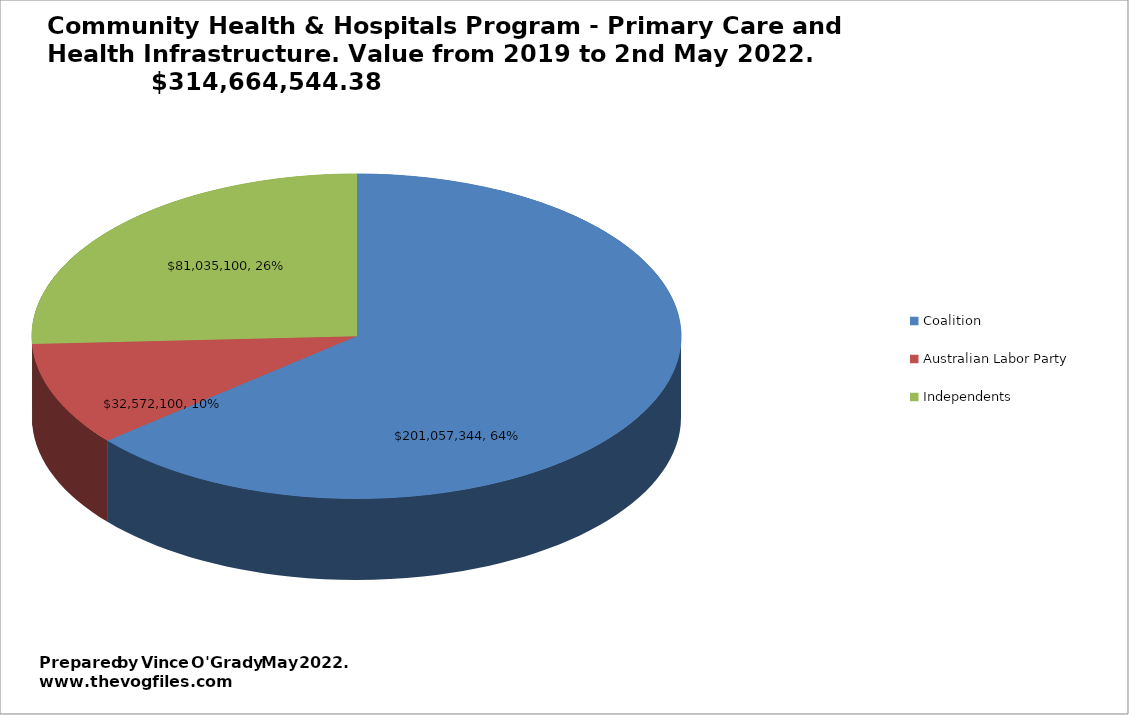
| Category | Community Health & Hospitals Program - Primary Care |
|---|---|
| Coalition | 201057344.38 |
| Australian Labor Party | 32572100 |
| Independents | 81035100 |